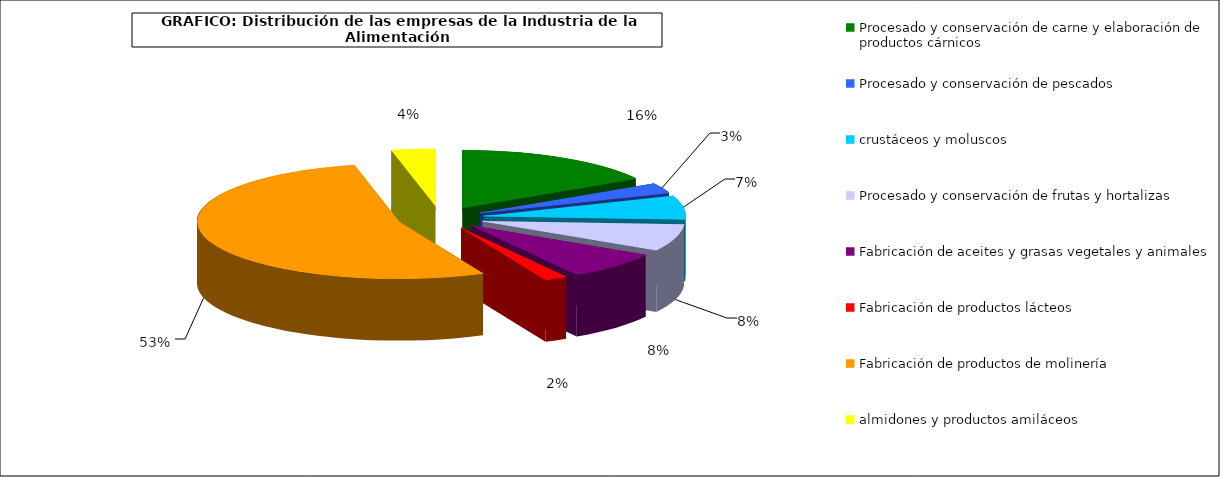
| Category | Procesado y conservación de carne y elaboración de productos cárnicos |
|---|---|
| 0 | 3641 |
| 1 | 619 |
| 2 | 1456 |
| 3 | 1670 |
| 4 | 1726 |
| 5 | 407 |
| 6 | 11778 |
| 7 | 775 |